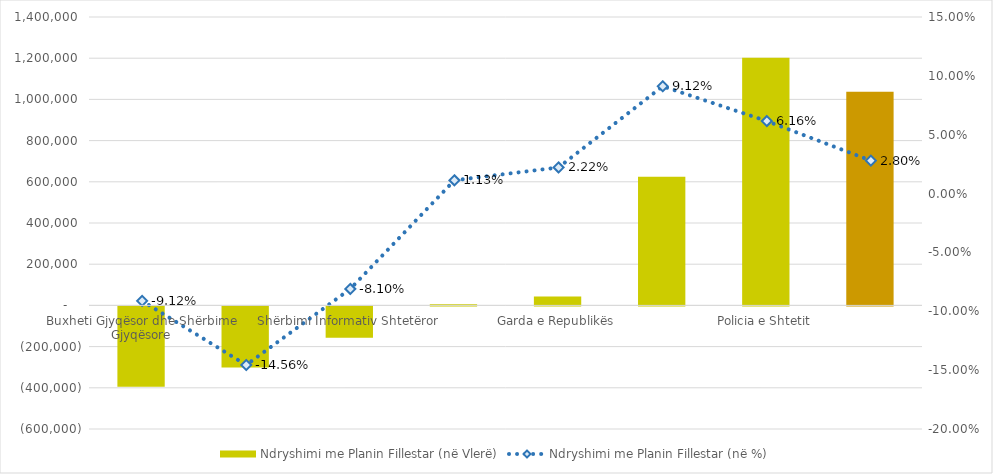
| Category | Ndryshimi me Planin Fillestar (në Vlerë) |
|---|---|
| Buxheti Gjyqësor dhe Shërbime Gjyqësore | -390400 |
| SPAK dhe Institucionet e Drejtësisë | -297000 |
| Shërbimi Informativ Shtetëror | -152000 |
| Gjykata Kushtetuese dhe Shërbimi i Avokatisë | 6000 |
| Garda e Republikës | 43500 |
| Sistemi i Burgjeve dhe Shërbimi i Provës | 624986 |
| Policia e Shtetit | 1202090 |
| Total Shpenzime për Rendin dhe Sigurinë Publike | 1037176 |